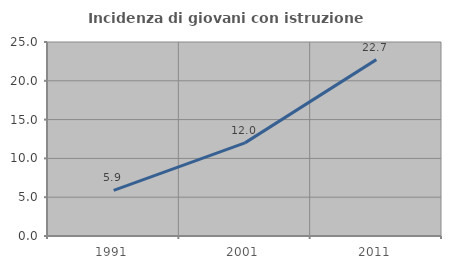
| Category | Incidenza di giovani con istruzione universitaria |
|---|---|
| 1991.0 | 5.882 |
| 2001.0 | 12 |
| 2011.0 | 22.727 |